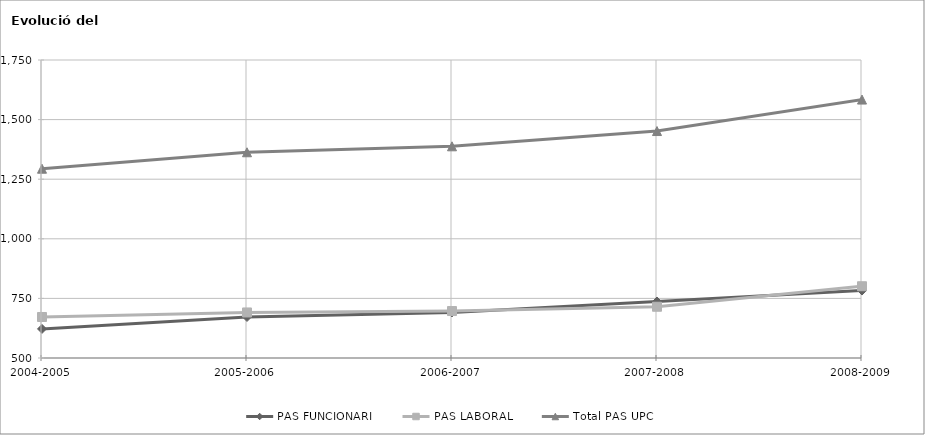
| Category | PAS FUNCIONARI | PAS LABORAL | Total PAS UPC |
|---|---|---|---|
| 2004-2005 | 622 | 672 | 1294 |
| 2005-2006 | 672 | 691 | 1363 |
| 2006-2007 | 691 | 697 | 1388 |
| 2007-2008 | 737 | 715 | 1452 |
| 2008-2009 | 783 | 801 | 1584 |